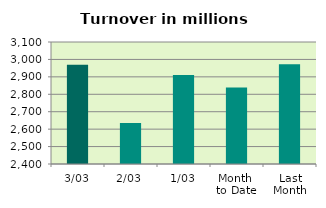
| Category | Series 0 |
|---|---|
| 3/03 | 2969.08 |
| 2/03 | 2635.352 |
| 1/03 | 2911.118 |
| Month 
to Date | 2838.517 |
| Last
Month | 2972.107 |